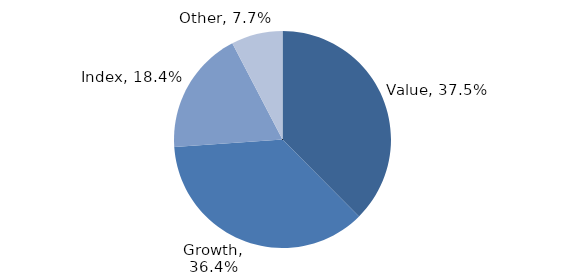
| Category | Investment Style |
|---|---|
| Value | 0.375 |
| Growth | 0.364 |
| Index | 0.184 |
| Other | 0.077 |